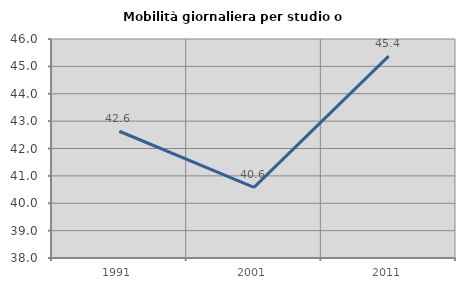
| Category | Mobilità giornaliera per studio o lavoro |
|---|---|
| 1991.0 | 42.63 |
| 2001.0 | 40.581 |
| 2011.0 | 45.376 |